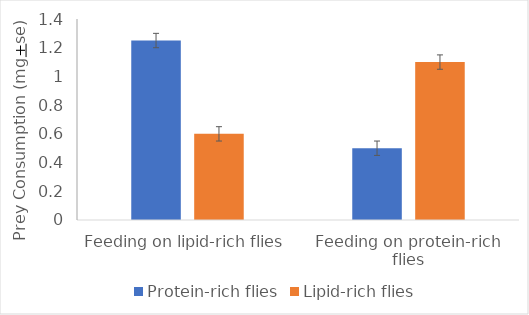
| Category | Protein-rich flies | Lipid-rich flies |
|---|---|---|
| Feeding on lipid-rich flies | 1.25 | 0.6 |
| Feeding on protein-rich flies | 0.5 | 1.1 |